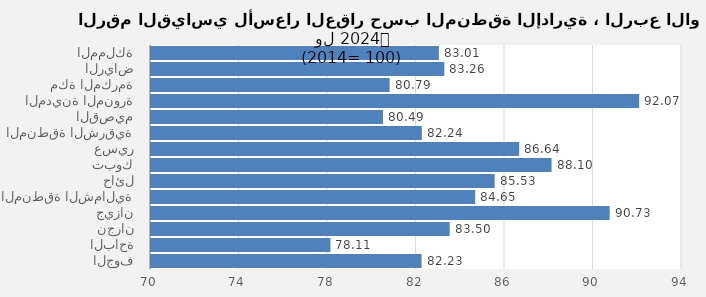
| Category | 2024 |
|---|---|
| المملكة | 83.013 |
| الرياض | 83.258 |
| مكة المكرمة | 80.785 |
| المدينة المنورة | 92.065 |
| القصيم | 80.485 |
| المنطقة الشرقية | 82.24 |
| عسير | 86.642 |
| تبوك | 88.104 |
| حائل | 85.533 |
| المنطقة الشمالية | 84.653 |
| جيزان | 90.73 |
| نجران | 83.499 |
| الباحة | 78.111 |
| الجوف | 82.229 |